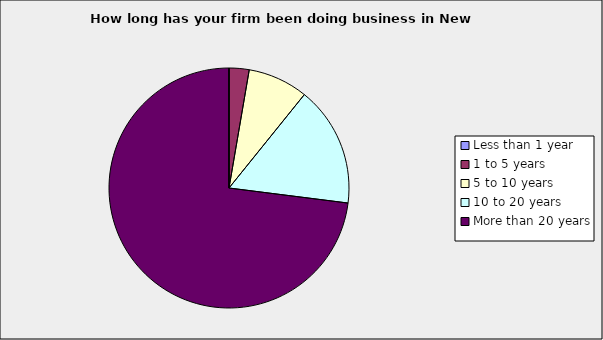
| Category | Series 0 |
|---|---|
| Less than 1 year | 0 |
| 1 to 5 years | 0.027 |
| 5 to 10 years | 0.081 |
| 10 to 20 years | 0.162 |
| More than 20 years | 0.73 |